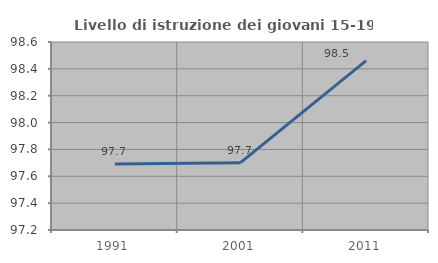
| Category | Livello di istruzione dei giovani 15-19 anni |
|---|---|
| 1991.0 | 97.692 |
| 2001.0 | 97.701 |
| 2011.0 | 98.462 |